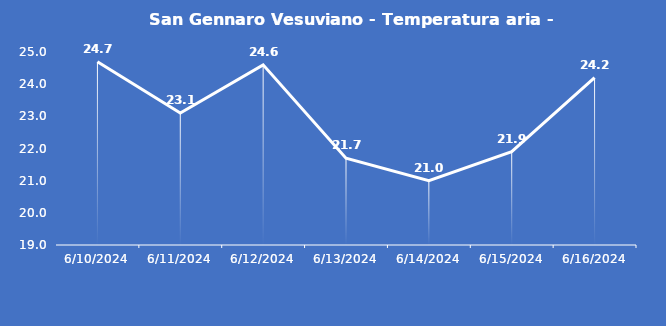
| Category | San Gennaro Vesuviano - Temperatura aria - Grezzo (°C) |
|---|---|
| 6/10/24 | 24.7 |
| 6/11/24 | 23.1 |
| 6/12/24 | 24.6 |
| 6/13/24 | 21.7 |
| 6/14/24 | 21 |
| 6/15/24 | 21.9 |
| 6/16/24 | 24.2 |